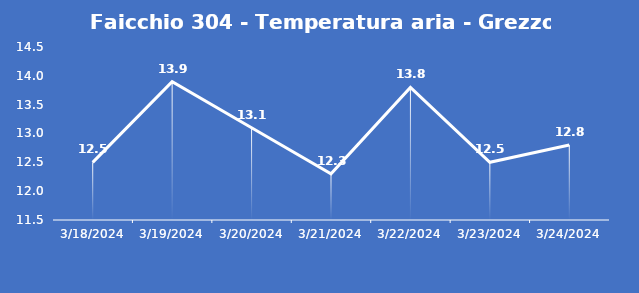
| Category | Faicchio 304 - Temperatura aria - Grezzo (°C) |
|---|---|
| 3/18/24 | 12.5 |
| 3/19/24 | 13.9 |
| 3/20/24 | 13.1 |
| 3/21/24 | 12.3 |
| 3/22/24 | 13.8 |
| 3/23/24 | 12.5 |
| 3/24/24 | 12.8 |